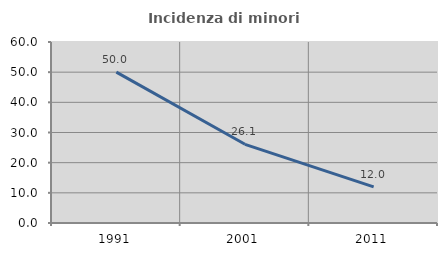
| Category | Incidenza di minori stranieri |
|---|---|
| 1991.0 | 50 |
| 2001.0 | 26.087 |
| 2011.0 | 12 |